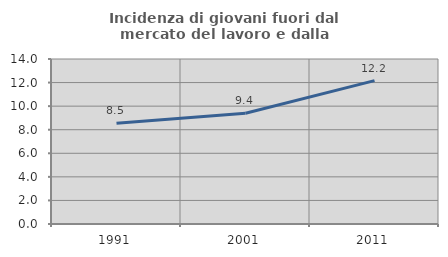
| Category | Incidenza di giovani fuori dal mercato del lavoro e dalla formazione  |
|---|---|
| 1991.0 | 8.541 |
| 2001.0 | 9.393 |
| 2011.0 | 12.167 |